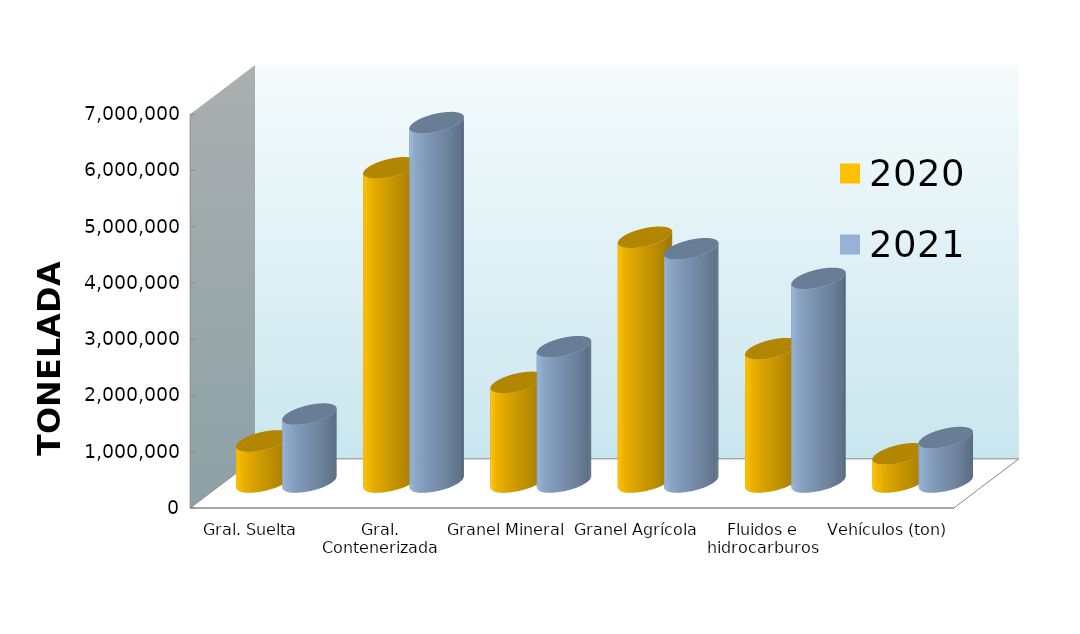
| Category | 2020 | 2021 |
|---|---|---|
| Gral. Suelta | 730220.986 | 1207219.559 |
| Gral. Contenerizada | 5584403.81 | 6387111.395 |
| Granel Mineral | 1770391.247 | 2403978.084 |
| Granel Agrícola | 4349191.709 | 4145692.56 |
| Fluidos e hidrocarburos | 2369900.436 | 3618388.576 |
| Vehículos (ton) | 500868.663 | 789665.519 |